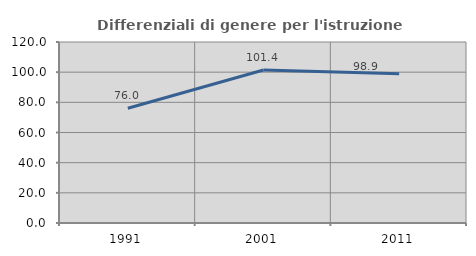
| Category | Differenziali di genere per l'istruzione superiore |
|---|---|
| 1991.0 | 76.045 |
| 2001.0 | 101.448 |
| 2011.0 | 98.923 |